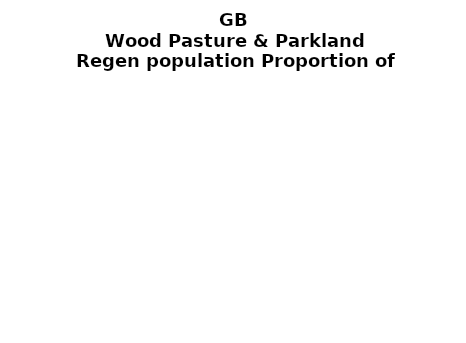
| Category | Wood Pasture & Parkland |
|---|---|
| None | 0.342 |
| Seedlings only | 0 |
| Seedlings, saplings only | 0.039 |
| Seedlings, saplings, <7 cm trees | 0.181 |
| Saplings only | 0.063 |
| <7 cm trees, seedlings only | 0 |
| <7 cm trees, saplings only | 0.313 |
| <7 cm Trees only | 0.063 |